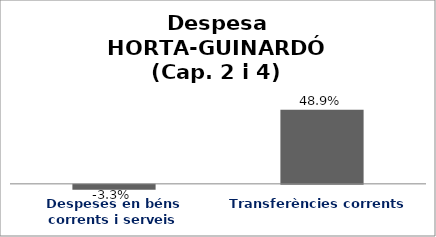
| Category | Series 0 |
|---|---|
| Despeses en béns corrents i serveis | -0.033 |
| Transferències corrents | 0.489 |